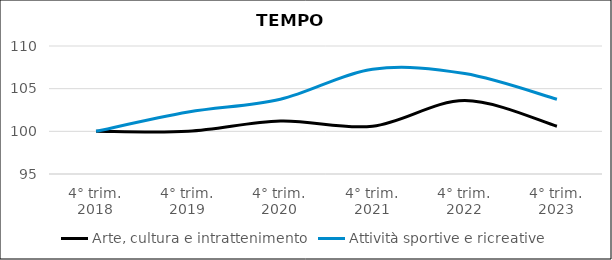
| Category | Arte, cultura e intrattenimento | Attività sportive e ricreative |
|---|---|---|
| 4° trim.
2018 | 100 | 100 |
| 4° trim.
2019 | 100 | 102.258 |
| 4° trim.
2020 | 101.201 | 103.764 |
| 4° trim.
2021 | 100.601 | 107.277 |
| 4° trim.
2022 | 103.604 | 106.775 |
| 4° trim.
2023 | 100.601 | 103.764 |